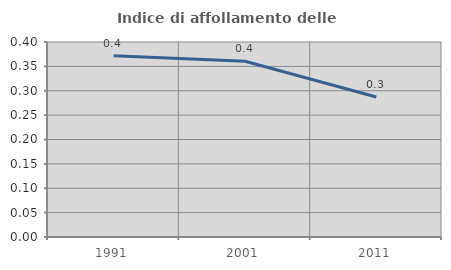
| Category | Indice di affollamento delle abitazioni  |
|---|---|
| 1991.0 | 0.372 |
| 2001.0 | 0.361 |
| 2011.0 | 0.287 |